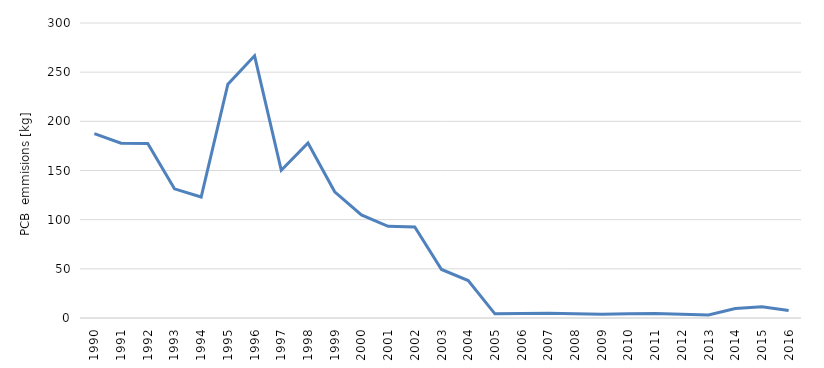
| Category | Series 0 |
|---|---|
| 1990.0 | 187.542 |
| 1991.0 | 177.694 |
| 1992.0 | 177.562 |
| 1993.0 | 131.335 |
| 1994.0 | 123.057 |
| 1995.0 | 237.829 |
| 1996.0 | 266.612 |
| 1997.0 | 150.215 |
| 1998.0 | 178.052 |
| 1999.0 | 128.324 |
| 2000.0 | 104.832 |
| 2001.0 | 93.296 |
| 2002.0 | 92.516 |
| 2003.0 | 49.312 |
| 2004.0 | 38.09 |
| 2005.0 | 4.24 |
| 2006.0 | 4.634 |
| 2007.0 | 4.879 |
| 2008.0 | 4.361 |
| 2009.0 | 3.806 |
| 2010.0 | 4.262 |
| 2011.0 | 4.693 |
| 2012.0 | 3.929 |
| 2013.0 | 3.104 |
| 2014.0 | 9.594 |
| 2015.0 | 11.517 |
| 2016.0 | 7.523 |